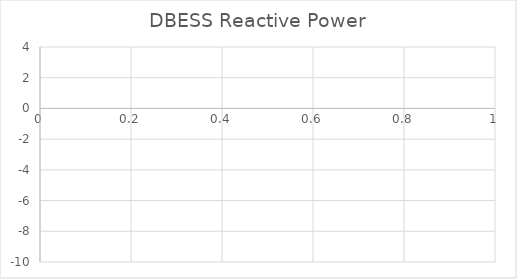
| Category | DBESS Reactive Power |
|---|---|
| 0 | -0.682 |
| 1 | -0.602 |
| 2 | -0.538 |
| 3 | -0.533 |
| 4 | -0.676 |
| 5 | -0.703 |
| 6 | -0.868 |
| 7 | -0.82 |
| 8 | -0.659 |
| 9 | -0.597 |
| 10 | -0.571 |
| 11 | -0.489 |
| 12 | -0.545 |
| 13 | -0.696 |
| 14 | -0.671 |
| 15 | -0.45 |
| 16 | -0.203 |
| 17 | -0.268 |
| 18 | -0.406 |
| 19 | -0.456 |
| 20 | -0.456 |
| 21 | -0.364 |
| 22 | -0.405 |
| 23 | -0.516 |
| 24 | -0.549 |
| 25 | -0.616 |
| 26 | -0.776 |
| 27 | -0.692 |
| 28 | -0.508 |
| 29 | -0.433 |
| 30 | -0.433 |
| 31 | -0.573 |
| 32 | -0.714 |
| 33 | -0.766 |
| 34 | -0.712 |
| 35 | -0.615 |
| 36 | -0.579 |
| 37 | -0.64 |
| 38 | -0.661 |
| 39 | -0.601 |
| 40 | -0.569 |
| 41 | -0.401 |
| 42 | -0.33 |
| 43 | -0.147 |
| 44 | -0.04 |
| 45 | 0.218 |
| 46 | 0.321 |
| 47 | 0.402 |
| 48 | 0.384 |
| 49 | 0.176 |
| 50 | 0.004 |
| 51 | -0.145 |
| 52 | -0.098 |
| 53 | 0.057 |
| 54 | 0.168 |
| 55 | 0.245 |
| 56 | 0.41 |
| 57 | 0.436 |
| 58 | 0.634 |
| 59 | 0.744 |
| 60 | 0.759 |
| 61 | 0.731 |
| 62 | 0.731 |
| 63 | 0.681 |
| 64 | 0.748 |
| 65 | 0.719 |
| 66 | 0.462 |
| 67 | 0.372 |
| 68 | 0.238 |
| 69 | 0.238 |
| 70 | 0.331 |
| 71 | 0.38 |
| 72 | 0.39 |
| 73 | 0.549 |
| 74 | 0.587 |
| 75 | 0.618 |
| 76 | 0.685 |
| 77 | 0.593 |
| 78 | 0.573 |
| 79 | 0.58 |
| 80 | 0.534 |
| 81 | 0.554 |
| 82 | 0.554 |
| 83 | 0.593 |
| 84 | 0.618 |
| 85 | 0.54 |
| 86 | 0.503 |
| 87 | 0.503 |
| 88 | 0.632 |
| 89 | 0.687 |
| 90 | 0.75 |
| 91 | 0.792 |
| 92 | 0.792 |
| 93 | 0.813 |
| 94 | 0.755 |
| 95 | 0.737 |
| 96 | 0.789 |
| 97 | 0.812 |
| 98 | 0.878 |
| 99 | 0.966 |
| 100 | 0.932 |
| 101 | 0.997 |
| 102 | 1.076 |
| 103 | 1.132 |
| 104 | 1.124 |
| 105 | 1.153 |
| 106 | 1.243 |
| 107 | 1.361 |
| 108 | 1.404 |
| 109 | 1.347 |
| 110 | 1.347 |
| 111 | 1.275 |
| 112 | 1.269 |
| 113 | 1.263 |
| 114 | 1.252 |
| 115 | 1.208 |
| 116 | 1.034 |
| 117 | 1.099 |
| 118 | 1.171 |
| 119 | 1.126 |
| 120 | 1.027 |
| 121 | 1.012 |
| 122 | 0.981 |
| 123 | 0.832 |
| 124 | 0.903 |
| 125 | 0.94 |
| 126 | 1.035 |
| 127 | 1.041 |
| 128 | 1.039 |
| 129 | 1.04 |
| 130 | 1.088 |
| 131 | 1.098 |
| 132 | 1.147 |
| 133 | 1.147 |
| 134 | 1.008 |
| 135 | 0.95 |
| 136 | 1.01 |
| 137 | 0.957 |
| 138 | 0.99 |
| 139 | 1.088 |
| 140 | 1.162 |
| 141 | 1.098 |
| 142 | 0.935 |
| 143 | 0.951 |
| 144 | 1.085 |
| 145 | 1.15 |
| 146 | 1.156 |
| 147 | 1.206 |
| 148 | 1.229 |
| 149 | 1.222 |
| 150 | 1.222 |
| 151 | 1.32 |
| 152 | 1.219 |
| 153 | 1.084 |
| 154 | 0.727 |
| 155 | 0.509 |
| 156 | 0.364 |
| 157 | 0.369 |
| 158 | 0.525 |
| 159 | 0.511 |
| 160 | 0.357 |
| 161 | 0.303 |
| 162 | 0.26 |
| 163 | 0.276 |
| 164 | 0.302 |
| 165 | 0.28 |
| 166 | 0.267 |
| 167 | 0.333 |
| 168 | 0.508 |
| 169 | 0.522 |
| 170 | 0.502 |
| 171 | 0.357 |
| 172 | 0.357 |
| 173 | 0.407 |
| 174 | 0.507 |
| 175 | 0.47 |
| 176 | 0.559 |
| 177 | 0.63 |
| 178 | 0.886 |
| 179 | 1.002 |
| 180 | 1.183 |
| 181 | 1.277 |
| 182 | 1.32 |
| 183 | 1.352 |
| 184 | 1.408 |
| 185 | 1.396 |
| 186 | 1.419 |
| 187 | 1.59 |
| 188 | 1.637 |
| 189 | 1.63 |
| 190 | 1.674 |
| 191 | 2.188 |
| 192 | 2.115 |
| 193 | 1.73 |
| 194 | 1.637 |
| 195 | 1.529 |
| 196 | 1.518 |
| 197 | 1.475 |
| 198 | 1.413 |
| 199 | 1.462 |
| 200 | 1.506 |
| 201 | 1.574 |
| 202 | 1.532 |
| 203 | 1.416 |
| 204 | 1.346 |
| 205 | 1.229 |
| 206 | 1.227 |
| 207 | 1.216 |
| 208 | 1.255 |
| 209 | 1.296 |
| 210 | 1.39 |
| 211 | 1.311 |
| 212 | 1.25 |
| 213 | 1.369 |
| 214 | 1.484 |
| 215 | 1.529 |
| 216 | 1.449 |
| 217 | 1.465 |
| 218 | 1.552 |
| 219 | 1.458 |
| 220 | 1.376 |
| 221 | 1.373 |
| 222 | 1.313 |
| 223 | 1.282 |
| 224 | 1.215 |
| 225 | 1.216 |
| 226 | 1.252 |
| 227 | 1.253 |
| 228 | 1.255 |
| 229 | 1.217 |
| 230 | 1.062 |
| 231 | 1.024 |
| 232 | 0.639 |
| 233 | 1.142 |
| 234 | 1.165 |
| 235 | 1.174 |
| 236 | 1.151 |
| 237 | 1.146 |
| 238 | 1.266 |
| 239 | 1.302 |
| 240 | 1.383 |
| 241 | 1.455 |
| 242 | 1.523 |
| 243 | 1.652 |
| 244 | 1.562 |
| 245 | 1.472 |
| 246 | 1.265 |
| 247 | 1.185 |
| 248 | 1.056 |
| 249 | 0.987 |
| 250 | 1.022 |
| 251 | 1.133 |
| 252 | 1.245 |
| 253 | 1.281 |
| 254 | 1.208 |
| 255 | 1.143 |
| 256 | 0.972 |
| 257 | 0.877 |
| 258 | 0.715 |
| 259 | 0.584 |
| 260 | 0.633 |
| 261 | 0.748 |
| 262 | 0.974 |
| 263 | 0.982 |
| 264 | 1.113 |
| 265 | 1.156 |
| 266 | 1.086 |
| 267 | 1.119 |
| 268 | 1.126 |
| 269 | 1.113 |
| 270 | 1.22 |
| 271 | 1.292 |
| 272 | 1.292 |
| 273 | 1.306 |
| 274 | 1.388 |
| 275 | 1.458 |
| 276 | 1.331 |
| 277 | 1.137 |
| 278 | 1.08 |
| 279 | 1.129 |
| 280 | 1.268 |
| 281 | 1.342 |
| 282 | 1.382 |
| 283 | 1.372 |
| 284 | 1.318 |
| 285 | 1.284 |
| 286 | 1.361 |
| 287 | 1.452 |
| 288 | 1.525 |
| 289 | 1.578 |
| 290 | 1.721 |
| 291 | 1.751 |
| 292 | 1.751 |
| 293 | 1.625 |
| 294 | 1.592 |
| 295 | 1.554 |
| 296 | 1.409 |
| 297 | 1.319 |
| 298 | 1.297 |
| 299 | 1.29 |
| 300 | 1.496 |
| 301 | 1.623 |
| 302 | 1.641 |
| 303 | 1.713 |
| 304 | 1.867 |
| 305 | 1.831 |
| 306 | 2.347 |
| 307 | 2.458 |
| 308 | 2.07 |
| 309 | 2.124 |
| 310 | 2.276 |
| 311 | 2.355 |
| 312 | 2.592 |
| 313 | 2.757 |
| 314 | 2.757 |
| 315 | 2.723 |
| 316 | 2.605 |
| 317 | 2.618 |
| 318 | 2.66 |
| 319 | 2.645 |
| 320 | 2.564 |
| 321 | 2.475 |
| 322 | 2.411 |
| 323 | 2.425 |
| 324 | 2.432 |
| 325 | 2.352 |
| 326 | 2.372 |
| 327 | 2.418 |
| 328 | 2.325 |
| 329 | 2.326 |
| 330 | 2.367 |
| 331 | 2.409 |
| 332 | 2.504 |
| 333 | 2.434 |
| 334 | 2.367 |
| 335 | 2.33 |
| 336 | 2.279 |
| 337 | 2.227 |
| 338 | 2.25 |
| 339 | 2.255 |
| 340 | 2.208 |
| 341 | 2.302 |
| 342 | 2.346 |
| 343 | 2.376 |
| 344 | 2.375 |
| 345 | 2.29 |
| 346 | 2.261 |
| 347 | 2.325 |
| 348 | 2.385 |
| 349 | 2.43 |
| 350 | 2.378 |
| 351 | 2.291 |
| 352 | 2.27 |
| 353 | 2.229 |
| 354 | 2.099 |
| 355 | 2.022 |
| 356 | 1.867 |
| 357 | 1.805 |
| 358 | 1.812 |
| 359 | 1.812 |
| 360 | 1.861 |
| 361 | 1.946 |
| 362 | 1.992 |
| 363 | 1.928 |
| 364 | 1.812 |
| 365 | 1.732 |
| 366 | 1.645 |
| 367 | 1.622 |
| 368 | 1.688 |
| 369 | 1.738 |
| 370 | 1.688 |
| 371 | 1.516 |
| 372 | 1.43 |
| 373 | 1.538 |
| 374 | 1.671 |
| 375 | 1.708 |
| 376 | 1.687 |
| 377 | 1.498 |
| 378 | 1.433 |
| 379 | 1.411 |
| 380 | 1.045 |
| 381 | 1.341 |
| 382 | 1.293 |
| 383 | 1.159 |
| 384 | 1.164 |
| 385 | 1.226 |
| 386 | 1.186 |
| 387 | 1.171 |
| 388 | 1.294 |
| 389 | 1.319 |
| 390 | 1.393 |
| 391 | 1.377 |
| 392 | 1.445 |
| 393 | 1.653 |
| 394 | 1.663 |
| 395 | 1.661 |
| 396 | 1.591 |
| 397 | 1.527 |
| 398 | 1.624 |
| 399 | 1.675 |
| 400 | 1.709 |
| 401 | 1.732 |
| 402 | 1.702 |
| 403 | 1.703 |
| 404 | 1.582 |
| 405 | 1.582 |
| 406 | 1.669 |
| 407 | 1.699 |
| 408 | 1.712 |
| 409 | 1.79 |
| 410 | 1.804 |
| 411 | 1.662 |
| 412 | 1.601 |
| 413 | 1.571 |
| 414 | 1.617 |
| 415 | 1.645 |
| 416 | 1.51 |
| 417 | 1.196 |
| 418 | 1.139 |
| 419 | 0.863 |
| 420 | 0.823 |
| 421 | 0.968 |
| 422 | 0.983 |
| 423 | 1.068 |
| 424 | 1.224 |
| 425 | 1.252 |
| 426 | 1.362 |
| 427 | 1.459 |
| 428 | 1.506 |
| 429 | 1.41 |
| 430 | 1.388 |
| 431 | 1.426 |
| 432 | 1.336 |
| 433 | 1.274 |
| 434 | 1.168 |
| 435 | 1.161 |
| 436 | 1.208 |
| 437 | 1.226 |
| 438 | 1.261 |
| 439 | 1.353 |
| 440 | 1.366 |
| 441 | 1.315 |
| 442 | 1.258 |
| 443 | 1.007 |
| 444 | 0.961 |
| 445 | 1.024 |
| 446 | 0.738 |
| 447 | 0.65 |
| 448 | 0.528 |
| 449 | 0.138 |
| 450 | -0.087 |
| 451 | -0.588 |
| 452 | -0.95 |
| 453 | -1.198 |
| 454 | -1.338 |
| 455 | -1.351 |
| 456 | -1.045 |
| 457 | -0.842 |
| 458 | -0.612 |
| 459 | -0.463 |
| 460 | -0.41 |
| 461 | -0.19 |
| 462 | -0.148 |
| 463 | -0.006 |
| 464 | -0.001 |
| 465 | 0.043 |
| 466 | -0.092 |
| 467 | -0.176 |
| 468 | -0.41 |
| 469 | -0.579 |
| 470 | -0.671 |
| 471 | -0.6 |
| 472 | -0.586 |
| 473 | -0.599 |
| 474 | -0.672 |
| 475 | -0.684 |
| 476 | -0.791 |
| 477 | -0.797 |
| 478 | -0.785 |
| 479 | -0.637 |
| 480 | -0.621 |
| 481 | -0.575 |
| 482 | -0.48 |
| 483 | -0.648 |
| 484 | -0.883 |
| 485 | -0.962 |
| 486 | -0.922 |
| 487 | -0.897 |
| 488 | -0.887 |
| 489 | -0.932 |
| 490 | -1.056 |
| 491 | -1.056 |
| 492 | -1.082 |
| 493 | -1.087 |
| 494 | -1.131 |
| 495 | -1.147 |
| 496 | -1.353 |
| 497 | -1.428 |
| 498 | -1.442 |
| 499 | -1.426 |
| 500 | -0.112 |
| 501 | -0.062 |
| 502 | 1.251 |
| 503 | 1.021 |
| 504 | 1.005 |
| 505 | 1.074 |
| 506 | 1.088 |
| 507 | 1.099 |
| 508 | 1.19 |
| 509 | 1.21 |
| 510 | 1.3 |
| 511 | 1.282 |
| 512 | 1.288 |
| 513 | 1.304 |
| 514 | 1.302 |
| 515 | 1.088 |
| 516 | 1.001 |
| 517 | 0.978 |
| 518 | 1.069 |
| 519 | 1.066 |
| 520 | 1.073 |
| 521 | 1.087 |
| 522 | 1.104 |
| 523 | 1.033 |
| 524 | 1.038 |
| 525 | 1.058 |
| 526 | 1.041 |
| 527 | 1.04 |
| 528 | 1.034 |
| 529 | 1.004 |
| 530 | 1.004 |
| 531 | 1.056 |
| 532 | 1.052 |
| 533 | 1.039 |
| 534 | 1.03 |
| 535 | 1.03 |
| 536 | 1.025 |
| 537 | 1.003 |
| 538 | -0.155 |
| 539 | -2.933 |
| 540 | -3.838 |
| 541 | -1.66 |
| 542 | -1.788 |
| 543 | -1.788 |
| 544 | -1.783 |
| 545 | -1.595 |
| 546 | -1.419 |
| 547 | -1.483 |
| 548 | -1.509 |
| 549 | -1.509 |
| 550 | -8.409 |
| 551 | -8.478 |
| 552 | -1.54 |
| 553 | -1.515 |
| 554 | -1.531 |
| 555 | -1.568 |
| 556 | -1.735 |
| 557 | -1.692 |
| 558 | -1.702 |
| 559 | -1.697 |
| 560 | -1.708 |
| 561 | -1.736 |
| 562 | -1.711 |
| 563 | -1.639 |
| 564 | -1.572 |
| 565 | -1.421 |
| 566 | -1.377 |
| 567 | -1.404 |
| 568 | -1.425 |
| 569 | -1.38 |
| 570 | -6.492 |
| 571 | -6.787 |
| 572 | -6.893 |
| 573 | -3.263 |
| 574 | -1.956 |
| 575 | -2.004 |
| 576 | -2.75 |
| 577 | -2.724 |
| 578 | -2.148 |
| 579 | -2.023 |
| 580 | -2.293 |
| 581 | -2.364 |
| 582 | -2.621 |
| 583 | -2.63 |
| 584 | -2.273 |
| 585 | -1.862 |
| 586 | -1.671 |
| 587 | -1.5 |
| 588 | -1.142 |
| 589 | -0.899 |
| 590 | -0.718 |
| 591 | -0.502 |
| 592 | -0.426 |
| 593 | -0.426 |
| 594 | -0.449 |
| 595 | -0.588 |
| 596 | -0.532 |
| 597 | -0.437 |
| 598 | -0.405 |
| 599 | -0.352 |
| 600 | -0.362 |
| 601 | -0.403 |
| 602 | -0.442 |
| 603 | -0.458 |
| 604 | -0.518 |
| 605 | -0.49 |
| 606 | -0.509 |
| 607 | -0.514 |
| 608 | -0.316 |
| 609 | -0.16 |
| 610 | -0.093 |
| 611 | 0.069 |
| 612 | 0.105 |
| 613 | -0.016 |
| 614 | -0.064 |
| 615 | -0.131 |
| 616 | 0.027 |
| 617 | 0.368 |
| 618 | 0.572 |
| 619 | 0.314 |
| 620 | 0.239 |
| 621 | 0.408 |
| 622 | 0.599 |
| 623 | 0.444 |
| 624 | 0.026 |
| 625 | 0.104 |
| 626 | 0.452 |
| 627 | 0.546 |
| 628 | 0.186 |
| 629 | 0.188 |
| 630 | 0.342 |
| 631 | 0.338 |
| 632 | 0.192 |
| 633 | 0.484 |
| 634 | 0.578 |
| 635 | 1.301 |
| 636 | 1.158 |
| 637 | 0.638 |
| 638 | 0.72 |
| 639 | 0.685 |
| 640 | 0.738 |
| 641 | 0.873 |
| 642 | 0.908 |
| 643 | 0.881 |
| 644 | 0.843 |
| 645 | 0.934 |
| 646 | 0.982 |
| 647 | 0.982 |
| 648 | 0.881 |
| 649 | 0.958 |
| 650 | 0.93 |
| 651 | 0.942 |
| 652 | 0.969 |
| 653 | 0.917 |
| 654 | 0.956 |
| 655 | 0.852 |
| 656 | 0.76 |
| 657 | 0.722 |
| 658 | 0.783 |
| 659 | 0.953 |
| 660 | 0.86 |
| 661 | 0.672 |
| 662 | 0.579 |
| 663 | 0.434 |
| 664 | 0.509 |
| 665 | 0.551 |
| 666 | 0.313 |
| 667 | 0.199 |
| 668 | 0.281 |
| 669 | 0.309 |
| 670 | 0.527 |
| 671 | 0.483 |
| 672 | 0.173 |
| 673 | -0.046 |
| 674 | -0.473 |
| 675 | -0.559 |
| 676 | -0.425 |
| 677 | -0.339 |
| 678 | -0.213 |
| 679 | -0.116 |
| 680 | -0.139 |
| 681 | -0.441 |
| 682 | -0.475 |
| 683 | -0.398 |
| 684 | -0.272 |
| 685 | -0.259 |
| 686 | -0.377 |
| 687 | -0.297 |
| 688 | -0.129 |
| 689 | -0.156 |
| 690 | -0.292 |
| 691 | -0.412 |
| 692 | -0.387 |
| 693 | -0.37 |
| 694 | -0.386 |
| 695 | -0.225 |
| 696 | -0.151 |
| 697 | 0.013 |
| 698 | -0.065 |
| 699 | -0.091 |
| 700 | -0.088 |
| 701 | -0.074 |
| 702 | -0.12 |
| 703 | -0.168 |
| 704 | -0.176 |
| 705 | -0.159 |
| 706 | -0.2 |
| 707 | -0.341 |
| 708 | -0.317 |
| 709 | -0.329 |
| 710 | -0.189 |
| 711 | -0.143 |
| 712 | -0.146 |
| 713 | -0.032 |
| 714 | -0.008 |
| 715 | -0.025 |
| 716 | -0.06 |
| 717 | -0.073 |
| 718 | -0.224 |
| 719 | -0.289 |
| 720 | -0.366 |
| 721 | -0.156 |
| 722 | -0.099 |
| 723 | -0.185 |
| 724 | -0.136 |
| 725 | 0.078 |
| 726 | 0.118 |
| 727 | 0.321 |
| 728 | 0.665 |
| 729 | 0.891 |
| 730 | 1 |
| 731 | 0.981 |
| 732 | 0.981 |
| 733 | 1.001 |
| 734 | 0.97 |
| 735 | 0.791 |
| 736 | 0.782 |
| 737 | 0.839 |
| 738 | 0.889 |
| 739 | 0.78 |
| 740 | 0.623 |
| 741 | 0.617 |
| 742 | 0.659 |
| 743 | 0.852 |
| 744 | 0.852 |
| 745 | 0.754 |
| 746 | 0.601 |
| 747 | 0.537 |
| 748 | 0.71 |
| 749 | 0.916 |
| 750 | 1.017 |
| 751 | 0.987 |
| 752 | 1.053 |
| 753 | 1.051 |
| 754 | 0.982 |
| 755 | 0.825 |
| 756 | 0.812 |
| 757 | 0.768 |
| 758 | 1.011 |
| 759 | 1.083 |
| 760 | 1.159 |
| 761 | 1.046 |
| 762 | 0.954 |
| 763 | 1.229 |
| 764 | 1.229 |
| 765 | 1.525 |
| 766 | 1.526 |
| 767 | 1.411 |
| 768 | 1.365 |
| 769 | 1.304 |
| 770 | 1.064 |
| 771 | 0.724 |
| 772 | 0.566 |
| 773 | -0.019 |
| 774 | 0.015 |
| 775 | 0.815 |
| 776 | 1.241 |
| 777 | 2.432 |
| 778 | 2.494 |
| 779 | 1.825 |
| 780 | 1.432 |
| 781 | 1.192 |
| 782 | 1.324 |
| 783 | 1.586 |
| 784 | 0.961 |
| 785 | 0.67 |
| 786 | 0.844 |
| 787 | 0.814 |
| 788 | 0.612 |
| 789 | -0.538 |
| 790 | -0.871 |
| 791 | -0.559 |
| 792 | -0.559 |
| 793 | -0.255 |
| 794 | 0.092 |
| 795 | 1.029 |
| 796 | 1.567 |
| 797 | 2.238 |
| 798 | 2.238 |
| 799 | 1.802 |
| 800 | 1.922 |
| 801 | 1.97 |
| 802 | 1.815 |
| 803 | 1.464 |
| 804 | 1.016 |
| 805 | -0.12 |
| 806 | -1.166 |
| 807 | -2.335 |
| 808 | -2.464 |
| 809 | -2.155 |
| 810 | -1.469 |
| 811 | -0.622 |
| 812 | 0.55 |
| 813 | 1.506 |
| 814 | 2.646 |
| 815 | 2.484 |
| 816 | 2.148 |
| 817 | 1.664 |
| 818 | 1.373 |
| 819 | 1.155 |
| 820 | 1.028 |
| 821 | 1.07 |
| 822 | 1.19 |
| 823 | 1.208 |
| 824 | 0.994 |
| 825 | 0.828 |
| 826 | 0.758 |
| 827 | 0.436 |
| 828 | 0.57 |
| 829 | 0.757 |
| 830 | 1.28 |
| 831 | 1.444 |
| 832 | 1.557 |
| 833 | 1.42 |
| 834 | 1.445 |
| 835 | 1.491 |
| 836 | 1.53 |
| 837 | 1.666 |
| 838 | 1.534 |
| 839 | 1.323 |
| 840 | 1.323 |
| 841 | 1.216 |
| 842 | 0.694 |
| 843 | 0.653 |
| 844 | 0.789 |
| 845 | 1.053 |
| 846 | 1.24 |
| 847 | 1.254 |
| 848 | 1.366 |
| 849 | 1.624 |
| 850 | 1.956 |
| 851 | 1.802 |
| 852 | 0.403 |
| 853 | 0.379 |
| 854 | 0.379 |
| 855 | 1.503 |
| 856 | 1.503 |
| 857 | 1.502 |
| 858 | 1.429 |
| 859 | 1.183 |
| 860 | 1.016 |
| 861 | 0.097 |
| 862 | 1.243 |
| 863 | 1.379 |
| 864 | 1.391 |
| 865 | 1.518 |
| 866 | 1.476 |
| 867 | 1.304 |
| 868 | 1.174 |
| 869 | 1.183 |
| 870 | 1.199 |
| 871 | 1.164 |
| 872 | 1.115 |
| 873 | 1.306 |
| 874 | 1.308 |
| 875 | 1.476 |
| 876 | 1.516 |
| 877 | 1.419 |
| 878 | 1.347 |
| 879 | 1.341 |
| 880 | 1.119 |
| 881 | 1.009 |
| 882 | 0.923 |
| 883 | 0.931 |
| 884 | 1.078 |
| 885 | 1.187 |
| 886 | 1.435 |
| 887 | 1.435 |
| 888 | 1.497 |
| 889 | 1.476 |
| 890 | 1.476 |
| 891 | 1.554 |
| 892 | 1.549 |
| 893 | 1.52 |
| 894 | 1.437 |
| 895 | 1.276 |
| 896 | 1.186 |
| 897 | 1.198 |
| 898 | 1.194 |
| 899 | 1.168 |
| 900 | 1.168 |
| 901 | 1.077 |
| 902 | 1.018 |
| 903 | 1.026 |
| 904 | 1.165 |
| 905 | 1.161 |
| 906 | 1.188 |
| 907 | 1.208 |
| 908 | 1.159 |
| 909 | 1.126 |
| 910 | 1.066 |
| 911 | 0.668 |
| 912 | 0.675 |
| 913 | 1.127 |
| 914 | 1.232 |
| 915 | 1.211 |
| 916 | 1.183 |
| 917 | 1.183 |
| 918 | 1.167 |
| 919 | 1.152 |
| 920 | 1.148 |
| 921 | 1.148 |
| 922 | 1.209 |
| 923 | 1.291 |
| 924 | 1.214 |
| 925 | 1.113 |
| 926 | 0.893 |
| 927 | 0.814 |
| 928 | 0.714 |
| 929 | 0.804 |
| 930 | 0.886 |
| 931 | 0.831 |
| 932 | 0.741 |
| 933 | 0.75 |
| 934 | 0.76 |
| 935 | 0.45 |
| 936 | 0.434 |
| 937 | 0.801 |
| 938 | 0.943 |
| 939 | 1.016 |
| 940 | 1.063 |
| 941 | 1.074 |
| 942 | 1.126 |
| 943 | 1.126 |
| 944 | 1.185 |
| 945 | 1.215 |
| 946 | 1.317 |
| 947 | 1.394 |
| 948 | 1.385 |
| 949 | 1.343 |
| 950 | 1.162 |
| 951 | 1.119 |
| 952 | 1.156 |
| 953 | 1.097 |
| 954 | 1.08 |
| 955 | 1.096 |
| 956 | 1.121 |
| 957 | 1.153 |
| 958 | 1.142 |
| 959 | 1.027 |
| 960 | 1.016 |
| 961 | 0.921 |
| 962 | 0.812 |
| 963 | 0.958 |
| 964 | 1.016 |
| 965 | 1.016 |
| 966 | 0.904 |
| 967 | 0.846 |
| 968 | 0.869 |
| 969 | 0.894 |
| 970 | 0.859 |
| 971 | 0.749 |
| 972 | 0.763 |
| 973 | 0.84 |
| 974 | 0.8 |
| 975 | 0.8 |
| 976 | 0.872 |
| 977 | 1.074 |
| 978 | 1.142 |
| 979 | 1.082 |
| 980 | 1.004 |
| 981 | 1.094 |
| 982 | 0.922 |
| 983 | 0.911 |
| 984 | 0.917 |
| 985 | 1.002 |
| 986 | 0.918 |
| 987 | 0.744 |
| 988 | 0.721 |
| 989 | 0.811 |
| 990 | 0.773 |
| 991 | 0.749 |
| 992 | 0.68 |
| 993 | 0.781 |
| 994 | 0.861 |
| 995 | 0.863 |
| 996 | 0.841 |
| 997 | 0.77 |
| 998 | 0.8 |
| 999 | 0.813 |
| 1000 | 0.835 |
| 1001 | 0.702 |
| 1002 | 0.576 |
| 1003 | 0.538 |
| 1004 | 0.499 |
| 1005 | 0.563 |
| 1006 | 0.631 |
| 1007 | 0.62 |
| 1008 | 0.637 |
| 1009 | 0.741 |
| 1010 | 0.87 |
| 1011 | 0.957 |
| 1012 | 0.874 |
| 1013 | 0.826 |
| 1014 | 0.946 |
| 1015 | 1.001 |
| 1016 | 0.999 |
| 1017 | 1.02 |
| 1018 | 1.04 |
| 1019 | 1.095 |
| 1020 | 1.125 |
| 1021 | 1.037 |
| 1022 | 0.982 |
| 1023 | 0.977 |
| 1024 | 0.921 |
| 1025 | 0.929 |
| 1026 | 0.951 |
| 1027 | 0.998 |
| 1028 | 1.122 |
| 1029 | 1.14 |
| 1030 | 1.024 |
| 1031 | 1.001 |
| 1032 | 0.866 |
| 1033 | 0.755 |
| 1034 | 0.824 |
| 1035 | 0.834 |
| 1036 | 0.814 |
| 1037 | 0.839 |
| 1038 | 0.941 |
| 1039 | 0.964 |
| 1040 | 0.884 |
| 1041 | 0.808 |
| 1042 | 0.725 |
| 1043 | 0.703 |
| 1044 | 0.705 |
| 1045 | 0.713 |
| 1046 | 0.809 |
| 1047 | 0.711 |
| 1048 | 0.652 |
| 1049 | 0.622 |
| 1050 | 0.607 |
| 1051 | 0.523 |
| 1052 | 0.426 |
| 1053 | 0.309 |
| 1054 | 0.226 |
| 1055 | 0.148 |
| 1056 | 0.139 |
| 1057 | 0.125 |
| 1058 | 0.162 |
| 1059 | 0.24 |
| 1060 | 0.448 |
| 1061 | 0.429 |
| 1062 | 0.35 |
| 1063 | 0.32 |
| 1064 | 0.218 |
| 1065 | 0.145 |
| 1066 | 0.145 |
| 1067 | 0.056 |
| 1068 | 0.044 |
| 1069 | 0.034 |
| 1070 | -0.051 |
| 1071 | -0.091 |
| 1072 | -0.204 |
| 1073 | -0.084 |
| 1074 | -0.048 |
| 1075 | -0.054 |
| 1076 | -0.225 |
| 1077 | -0.312 |
| 1078 | -0.4 |
| 1079 | -0.486 |
| 1080 | -0.52 |
| 1081 | -0.644 |
| 1082 | -0.718 |
| 1083 | -0.718 |
| 1084 | -0.749 |
| 1085 | -0.774 |
| 1086 | -0.855 |
| 1087 | -0.971 |
| 1088 | -0.977 |
| 1089 | -1.086 |
| 1090 | -1.048 |
| 1091 | -1.04 |
| 1092 | -1.051 |
| 1093 | -1.095 |
| 1094 | -1.146 |
| 1095 | -1.208 |
| 1096 | -1.262 |
| 1097 | -1.262 |
| 1098 | -1.262 |
| 1099 | -1.322 |
| 1100 | -1.375 |
| 1101 | -1.498 |
| 1102 | -1.578 |
| 1103 | -1.578 |
| 1104 | -1.639 |
| 1105 | -1.682 |
| 1106 | -1.56 |
| 1107 | -1.522 |
| 1108 | -1.416 |
| 1109 | -1.416 |
| 1110 | -1.382 |
| 1111 | -1.423 |
| 1112 | -1.423 |
| 1113 | -1.296 |
| 1114 | -1.275 |
| 1115 | -1.31 |
| 1116 | -1.324 |
| 1117 | -1.317 |
| 1118 | -1.309 |
| 1119 | -1.401 |
| 1120 | -1.394 |
| 1121 | -1.412 |
| 1122 | -1.55 |
| 1123 | -1.609 |
| 1124 | -1.807 |
| 1125 | -1.918 |
| 1126 | -1.979 |
| 1127 | -2.099 |
| 1128 | -2.297 |
| 1129 | -2.424 |
| 1130 | -2.71 |
| 1131 | -2.887 |
| 1132 | -3.057 |
| 1133 | -3.228 |
| 1134 | -3.438 |
| 1135 | -3.714 |
| 1136 | -4.351 |
| 1137 | -4.431 |
| 1138 | -4.339 |
| 1139 | -4.554 |
| 1140 | -4.598 |
| 1141 | -4.673 |
| 1142 | -4.654 |
| 1143 | -4.426 |
| 1144 | -4.426 |
| 1145 | -4.536 |
| 1146 | -4.536 |
| 1147 | -4.376 |
| 1148 | -4.241 |
| 1149 | -4.265 |
| 1150 | -4.199 |
| 1151 | -4.055 |
| 1152 | -4.055 |
| 1153 | -4.059 |
| 1154 | -4.039 |
| 1155 | -3.959 |
| 1156 | -3.964 |
| 1157 | -3.874 |
| 1158 | -3.835 |
| 1159 | -3.877 |
| 1160 | -3.897 |
| 1161 | -3.871 |
| 1162 | -3.86 |
| 1163 | -3.782 |
| 1164 | -3.733 |
| 1165 | -3.794 |
| 1166 | -3.866 |
| 1167 | -3.938 |
| 1168 | -4.043 |
| 1169 | -3.996 |
| 1170 | -3.926 |
| 1171 | -3.935 |
| 1172 | -3.852 |
| 1173 | -3.825 |
| 1174 | -3.807 |
| 1175 | -3.804 |
| 1176 | -3.863 |
| 1177 | -3.891 |
| 1178 | -3.898 |
| 1179 | -3.987 |
| 1180 | -3.995 |
| 1181 | -3.971 |
| 1182 | -3.928 |
| 1183 | -3.859 |
| 1184 | -3.835 |
| 1185 | -3.832 |
| 1186 | -3.751 |
| 1187 | -3.847 |
| 1188 | -3.832 |
| 1189 | -3.806 |
| 1190 | -3.87 |
| 1191 | -4.005 |
| 1192 | -4.067 |
| 1193 | -4.028 |
| 1194 | -4.124 |
| 1195 | -4.153 |
| 1196 | -4.22 |
| 1197 | -4.173 |
| 1198 | -4.112 |
| 1199 | -4.155 |
| 1200 | -4.155 |
| 1201 | -4.222 |
| 1202 | -4.22 |
| 1203 | -4.061 |
| 1204 | -4.019 |
| 1205 | -4.005 |
| 1206 | -4.054 |
| 1207 | -4.053 |
| 1208 | -4.023 |
| 1209 | -3.948 |
| 1210 | -3.967 |
| 1211 | -3.979 |
| 1212 | -3.999 |
| 1213 | -3.839 |
| 1214 | -3.727 |
| 1215 | -3.625 |
| 1216 | -3.714 |
| 1217 | -3.726 |
| 1218 | -3.66 |
| 1219 | -3.622 |
| 1220 | -3.619 |
| 1221 | -3.619 |
| 1222 | -3.728 |
| 1223 | -3.726 |
| 1224 | -3.623 |
| 1225 | -3.584 |
| 1226 | -3.616 |
| 1227 | -3.627 |
| 1228 | -3.625 |
| 1229 | -3.541 |
| 1230 | -3.509 |
| 1231 | -3.58 |
| 1232 | -3.654 |
| 1233 | -3.643 |
| 1234 | -3.578 |
| 1235 | -3.523 |
| 1236 | -3.514 |
| 1237 | -3.543 |
| 1238 | -3.499 |
| 1239 | -3.41 |
| 1240 | -3.441 |
| 1241 | -3.441 |
| 1242 | -3.476 |
| 1243 | -3.422 |
| 1244 | -3.401 |
| 1245 | -3.401 |
| 1246 | -3.35 |
| 1247 | -3.38 |
| 1248 | -3.389 |
| 1249 | -3.435 |
| 1250 | -3.435 |
| 1251 | -3.305 |
| 1252 | -3.168 |
| 1253 | -3.168 |
| 1254 | -3.17 |
| 1255 | -3.17 |
| 1256 | -3.192 |
| 1257 | -3.266 |
| 1258 | -3.268 |
| 1259 | -3.199 |
| 1260 | -3.13 |
| 1261 | -3.011 |
| 1262 | -3.006 |
| 1263 | -3.046 |
| 1264 | -3.049 |
| 1265 | -3.012 |
| 1266 | -3.062 |
| 1267 | -3.113 |
| 1268 | -3.233 |
| 1269 | -3.16 |
| 1270 | -3.058 |
| 1271 | -2.993 |
| 1272 | -2.912 |
| 1273 | -2.879 |
| 1274 | -2.849 |
| 1275 | -2.862 |
| 1276 | -2.901 |
| 1277 | -2.988 |
| 1278 | -3.046 |
| 1279 | -3.062 |
| 1280 | -3.037 |
| 1281 | -3.013 |
| 1282 | -3.14 |
| 1283 | -3.197 |
| 1284 | -3.089 |
| 1285 | -3.172 |
| 1286 | -3.2 |
| 1287 | -3.036 |
| 1288 | -3.133 |
| 1289 | -3.134 |
| 1290 | -3.095 |
| 1291 | -3.02 |
| 1292 | -3.006 |
| 1293 | -2.947 |
| 1294 | -2.886 |
| 1295 | -2.851 |
| 1296 | -2.871 |
| 1297 | -2.904 |
| 1298 | -2.902 |
| 1299 | -2.843 |
| 1300 | -2.836 |
| 1301 | -2.885 |
| 1302 | -2.886 |
| 1303 | -2.956 |
| 1304 | -3.012 |
| 1305 | -2.994 |
| 1306 | -2.973 |
| 1307 | -3.021 |
| 1308 | -3.049 |
| 1309 | -3.065 |
| 1310 | -3.033 |
| 1311 | -3.027 |
| 1312 | -3.062 |
| 1313 | -3.08 |
| 1314 | -3.066 |
| 1315 | -3.053 |
| 1316 | -3.021 |
| 1317 | -2.971 |
| 1318 | -2.924 |
| 1319 | -2.916 |
| 1320 | -2.959 |
| 1321 | -3.013 |
| 1322 | -3.07 |
| 1323 | -3.07 |
| 1324 | -3.031 |
| 1325 | -2.91 |
| 1326 | -2.806 |
| 1327 | -2.872 |
| 1328 | -2.872 |
| 1329 | -2.891 |
| 1330 | -2.788 |
| 1331 | -2.87 |
| 1332 | -2.841 |
| 1333 | -2.688 |
| 1334 | -2.581 |
| 1335 | -2.754 |
| 1336 | -2.775 |
| 1337 | -2.753 |
| 1338 | -2.711 |
| 1339 | -2.659 |
| 1340 | -2.598 |
| 1341 | -2.527 |
| 1342 | -2.527 |
| 1343 | -2.537 |
| 1344 | -2.509 |
| 1345 | -2.365 |
| 1346 | -2.309 |
| 1347 | -2.117 |
| 1348 | -2.084 |
| 1349 | -2.124 |
| 1350 | -1.718 |
| 1351 | -1.718 |
| 1352 | -1.819 |
| 1353 | -1.906 |
| 1354 | -1.906 |
| 1355 | -1.913 |
| 1356 | -1.888 |
| 1357 | -1.834 |
| 1358 | -1.87 |
| 1359 | -1.895 |
| 1360 | -1.898 |
| 1361 | -1.75 |
| 1362 | -1.689 |
| 1363 | -1.698 |
| 1364 | -1.775 |
| 1365 | -1.75 |
| 1366 | -1.751 |
| 1367 | -1.78 |
| 1368 | -1.775 |
| 1369 | -1.681 |
| 1370 | -1.613 |
| 1371 | -1.602 |
| 1372 | -1.521 |
| 1373 | -1.504 |
| 1374 | -1.592 |
| 1375 | -1.665 |
| 1376 | -1.628 |
| 1377 | -1.549 |
| 1378 | -1.475 |
| 1379 | -1.531 |
| 1380 | -1.564 |
| 1381 | -1.532 |
| 1382 | -1.398 |
| 1383 | -1.281 |
| 1384 | -1.253 |
| 1385 | -1.228 |
| 1386 | -1.139 |
| 1387 | -0.995 |
| 1388 | -1.083 |
| 1389 | -1.143 |
| 1390 | -1.054 |
| 1391 | -1.11 |
| 1392 | -0.961 |
| 1393 | -0.961 |
| 1394 | -1.033 |
| 1395 | -1.138 |
| 1396 | -1.013 |
| 1397 | -0.887 |
| 1398 | -0.735 |
| 1399 | -0.8 |
| 1400 | -0.809 |
| 1401 | -0.785 |
| 1402 | -0.762 |
| 1403 | -0.762 |
| 1404 | -0.784 |
| 1405 | -0.82 |
| 1406 | -0.758 |
| 1407 | -0.743 |
| 1408 | -0.68 |
| 1409 | -0.65 |
| 1410 | -0.596 |
| 1411 | -0.526 |
| 1412 | -0.346 |
| 1413 | -0.291 |
| 1414 | -0.327 |
| 1415 | -0.359 |
| 1416 | -0.439 |
| 1417 | -0.509 |
| 1418 | -0.583 |
| 1419 | -0.613 |
| 1420 | -0.578 |
| 1421 | -0.531 |
| 1422 | -0.565 |
| 1423 | -0.565 |
| 1424 | -0.471 |
| 1425 | -0.472 |
| 1426 | -0.47 |
| 1427 | -0.372 |
| 1428 | -0.321 |
| 1429 | -0.37 |
| 1430 | -0.393 |
| 1431 | -0.452 |
| 1432 | -0.7 |
| 1433 | -0.99 |
| 1434 | -1.28 |
| 1435 | -1.49 |
| 1436 | -1.433 |
| 1437 | -1.421 |
| 1438 | -1.525 |
| 1439 | -1.732 |
| 1440 | -1.808 |
| 1441 | -1.675 |
| 1442 | -1.716 |
| 1443 | -1.751 |
| 1444 | -1.593 |
| 1445 | -1.569 |
| 1446 | -1.523 |
| 1447 | -1.432 |
| 1448 | -1.538 |
| 1449 | -1.62 |
| 1450 | -1.562 |
| 1451 | -1.54 |
| 1452 | -1.509 |
| 1453 | -1.385 |
| 1454 | -1.395 |
| 1455 | -1.43 |
| 1456 | -1.471 |
| 1457 | -1.421 |
| 1458 | -1.347 |
| 1459 | -1.255 |
| 1460 | -1.321 |
| 1461 | -1.336 |
| 1462 | -1.343 |